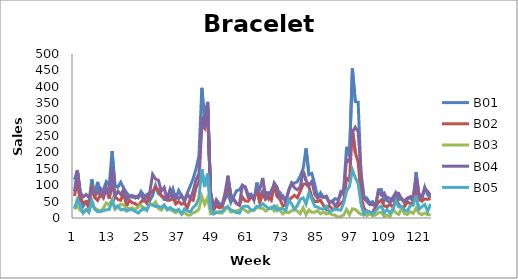
| Category | B01 | B02 | B03 | B04 | B05 |
|---|---|---|---|---|---|
| 0 | 117 | 67 | 27 | 81 | 29 |
| 1 | 145 | 113 | 37 | 146 | 57 |
| 2 | 70 | 55 | 23 | 79 | 38 |
| 3 | 36 | 47 | 17 | 64 | 15 |
| 4 | 51 | 49 | 23 | 72 | 26 |
| 5 | 49 | 30 | 28 | 63 | 17 |
| 6 | 118 | 96 | 37 | 86 | 54 |
| 7 | 61 | 63 | 30 | 76 | 27 |
| 8 | 110 | 54 | 25 | 75 | 19 |
| 9 | 71 | 72 | 21 | 89 | 20 |
| 10 | 87 | 61 | 30 | 66 | 22 |
| 11 | 111 | 91 | 46 | 93 | 25 |
| 12 | 99 | 59 | 40 | 71 | 26 |
| 13 | 204 | 109 | 57 | 156 | 51 |
| 14 | 99 | 66 | 26 | 64 | 31 |
| 15 | 94 | 57 | 33 | 82 | 37 |
| 16 | 109 | 54 | 42 | 72 | 25 |
| 17 | 91 | 76 | 40 | 87 | 27 |
| 18 | 77 | 36 | 31 | 56 | 21 |
| 19 | 66 | 54 | 29 | 67 | 25 |
| 20 | 63 | 46 | 31 | 69 | 25 |
| 21 | 66 | 44 | 25 | 61 | 20 |
| 22 | 61 | 35 | 35 | 68 | 15 |
| 23 | 81 | 49 | 40 | 70 | 24 |
| 24 | 69 | 58 | 25 | 54 | 31 |
| 25 | 66 | 45 | 26 | 71 | 23 |
| 26 | 52 | 74 | 42 | 77 | 43 |
| 27 | 69 | 81 | 39 | 133 | 40 |
| 28 | 99 | 94 | 49 | 119 | 35 |
| 29 | 74 | 85 | 29 | 115 | 36 |
| 30 | 69 | 67 | 24 | 82 | 32 |
| 31 | 56 | 64 | 36 | 93 | 40 |
| 32 | 57 | 54 | 30 | 55 | 25 |
| 33 | 68 | 54 | 26 | 86 | 32 |
| 34 | 89 | 62 | 21 | 61 | 26 |
| 35 | 58 | 43 | 16 | 70 | 22 |
| 36 | 84 | 50 | 24 | 59 | 26 |
| 37 | 68 | 42 | 11 | 69 | 13 |
| 38 | 55 | 46 | 17 | 49 | 28 |
| 39 | 76 | 31 | 9 | 74 | 22 |
| 40 | 98 | 58 | 9 | 59 | 19 |
| 41 | 120 | 54 | 16 | 82 | 32 |
| 42 | 150 | 93 | 19 | 117 | 40 |
| 43 | 189 | 111 | 27 | 136 | 61 |
| 44 | 397 | 285 | 66 | 309 | 149 |
| 45 | 292 | 273 | 42 | 274 | 95 |
| 46 | 354 | 329 | 62 | 352 | 135 |
| 47 | 82 | 73 | 13 | 80 | 30 |
| 48 | 33 | 24 | 15 | 32 | 12 |
| 49 | 46 | 37 | 19 | 56 | 16 |
| 50 | 36 | 31 | 15 | 44 | 19 |
| 51 | 36 | 33 | 15 | 41 | 19 |
| 52 | 58 | 67 | 25 | 75 | 31 |
| 53 | 74 | 99 | 35 | 129 | 34 |
| 54 | 47 | 69 | 18 | 71 | 25 |
| 55 | 65 | 57 | 20 | 58 | 21 |
| 56 | 83 | 44 | 22 | 44 | 16 |
| 57 | 86 | 38 | 24 | 44 | 15 |
| 58 | 100 | 64 | 31 | 99 | 34 |
| 59 | 95 | 52 | 23 | 93 | 36 |
| 60 | 71 | 51 | 17 | 64 | 35 |
| 61 | 73 | 65 | 24 | 68 | 24 |
| 62 | 54 | 57 | 23 | 60 | 25 |
| 63 | 108 | 88 | 33 | 85 | 36 |
| 64 | 64 | 48 | 30 | 87 | 35 |
| 65 | 82 | 73 | 30 | 122 | 44 |
| 66 | 80 | 57 | 21 | 62 | 36 |
| 67 | 60 | 64 | 27 | 77 | 30 |
| 68 | 85 | 54 | 33 | 73 | 29 |
| 69 | 101 | 101 | 22 | 107 | 37 |
| 70 | 82 | 66 | 36 | 94 | 23 |
| 71 | 78 | 57 | 23 | 59 | 29 |
| 72 | 60 | 36 | 13 | 67 | 28 |
| 73 | 58 | 42 | 19 | 45 | 23 |
| 74 | 81 | 53 | 16 | 86 | 55 |
| 75 | 107 | 62 | 22 | 106 | 43 |
| 76 | 106 | 69 | 26 | 92 | 27 |
| 77 | 111 | 62 | 21 | 86 | 38 |
| 78 | 128 | 81 | 13 | 95 | 57 |
| 79 | 151 | 103 | 31 | 143 | 61 |
| 80 | 212 | 104 | 10 | 114 | 43 |
| 81 | 132 | 94 | 25 | 99 | 77 |
| 82 | 136 | 64 | 17 | 112 | 57 |
| 83 | 103 | 50 | 18 | 72 | 36 |
| 84 | 62 | 50 | 22 | 61 | 33 |
| 85 | 77 | 54 | 13 | 66 | 28 |
| 86 | 63 | 38 | 18 | 63 | 27 |
| 87 | 67 | 26 | 12 | 64 | 36 |
| 88 | 49 | 38 | 15 | 46 | 19 |
| 89 | 49 | 28 | 10 | 52 | 22 |
| 90 | 59 | 27 | 9 | 37 | 28 |
| 91 | 56 | 36 | 2 | 47 | 25 |
| 92 | 69 | 45 | 5 | 81 | 24 |
| 93 | 86 | 53 | 9 | 84 | 46 |
| 94 | 217 | 122 | 26 | 179 | 82 |
| 95 | 188 | 113 | 10 | 171 | 97 |
| 96 | 456 | 271 | 28 | 262 | 147 |
| 97 | 355 | 200 | 26 | 277 | 123 |
| 98 | 353 | 170 | 18 | 263 | 105 |
| 99 | 127 | 66 | 11 | 137 | 42 |
| 100 | 65 | 30 | 13 | 61 | 11 |
| 101 | 61 | 20 | 7 | 50 | 22 |
| 102 | 46 | 14 | 13 | 41 | 19 |
| 103 | 50 | 17 | 7 | 41 | 12 |
| 104 | 35 | 34 | 9 | 37 | 21 |
| 105 | 86 | 48 | 16 | 81 | 32 |
| 106 | 87 | 55 | 17 | 70 | 36 |
| 107 | 52 | 37 | 5 | 76 | 16 |
| 108 | 64 | 34 | 9 | 54 | 26 |
| 109 | 59 | 42 | 4 | 46 | 15 |
| 110 | 53 | 33 | 27 | 63 | 26 |
| 111 | 76 | 56 | 16 | 77 | 51 |
| 112 | 56 | 42 | 11 | 75 | 34 |
| 113 | 60 | 32 | 30 | 56 | 36 |
| 114 | 45 | 35 | 13 | 53 | 24 |
| 115 | 57 | 49 | 11 | 61 | 21 |
| 116 | 63 | 44 | 19 | 65 | 38 |
| 117 | 49 | 45 | 14 | 66 | 39 |
| 118 | 139 | 91 | 30 | 122 | 68 |
| 119 | 69 | 56 | 15 | 71 | 27 |
| 120 | 55 | 52 | 10 | 65 | 34 |
| 121 | 94 | 58 | 15 | 91 | 41 |
| 122 | 71 | 57 | 10 | 81 | 20 |
| 123 | 61 | 59 | 11 | 69 | 43 |